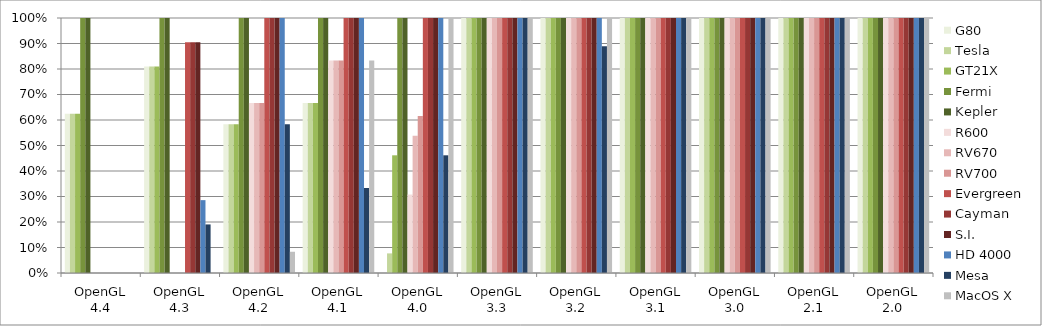
| Category | G80 | Tesla | GT21X | Fermi | Kepler | R600 | RV670 | RV700 | Evergreen | Cayman | S.I. | HD 4000 | Mesa | MacOS X |
|---|---|---|---|---|---|---|---|---|---|---|---|---|---|---|
| OpenGL 4.4 | 0.625 | 0.625 | 0.625 | 1 | 1 | 0 | 0 | 0 | 0 | 0 | 0 | 0 | 0 | 0 |
| OpenGL 4.3 | 0.81 | 0.81 | 0.81 | 1 | 1 | 0 | 0 | 0 | 0.905 | 0.905 | 0.905 | 0.286 | 0.19 | 0 |
| OpenGL 4.2 | 0.583 | 0.583 | 0.583 | 1 | 1 | 0.667 | 0.667 | 0.667 | 1 | 1 | 1 | 1 | 0.583 | 0.083 |
| OpenGL 4.1 | 0.667 | 0.667 | 0.667 | 1 | 1 | 0.833 | 0.833 | 0.833 | 1 | 1 | 1 | 1 | 0.333 | 0.833 |
| OpenGL 4.0 | 0 | 0.077 | 0.462 | 1 | 1 | 0.308 | 0.538 | 0.615 | 1 | 1 | 1 | 1 | 0.462 | 1 |
| OpenGL 3.3 | 1 | 1 | 1 | 1 | 1 | 1 | 1 | 1 | 1 | 1 | 1 | 1 | 1 | 1 |
| OpenGL 3.2 | 1 | 1 | 1 | 1 | 1 | 1 | 1 | 1 | 1 | 1 | 1 | 1 | 0.889 | 1 |
| OpenGL 3.1 | 1 | 1 | 1 | 1 | 1 | 1 | 1 | 1 | 1 | 1 | 1 | 1 | 1 | 1 |
| OpenGL 3.0 | 1 | 1 | 1 | 1 | 1 | 1 | 1 | 1 | 1 | 1 | 1 | 1 | 1 | 1 |
| OpenGL 2.1 | 1 | 1 | 1 | 1 | 1 | 1 | 1 | 1 | 1 | 1 | 1 | 1 | 1 | 1 |
| OpenGL 2.0 | 1 | 1 | 1 | 1 | 1 | 1 | 1 | 1 | 1 | 1 | 1 | 1 | 1 | 1 |